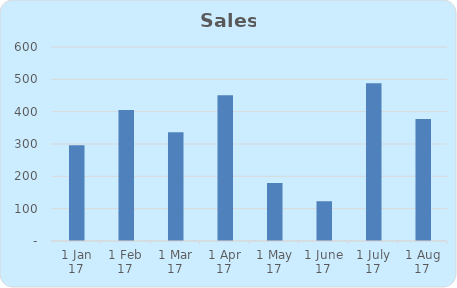
| Category | Sales |
|---|---|
| 2017-01-01 | 296 |
| 2017-02-01 | 405 |
| 2017-03-01 | 336 |
| 2017-04-01 | 451 |
| 2017-05-01 | 179 |
| 2017-06-01 | 123 |
| 2017-07-01 | 488 |
| 2017-08-01 | 377 |